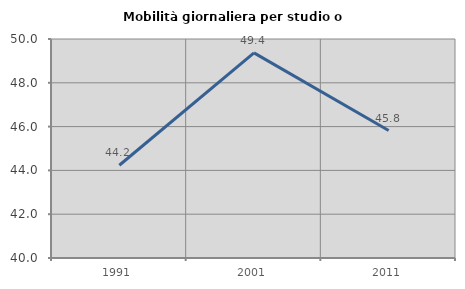
| Category | Mobilità giornaliera per studio o lavoro |
|---|---|
| 1991.0 | 44.235 |
| 2001.0 | 49.365 |
| 2011.0 | 45.821 |